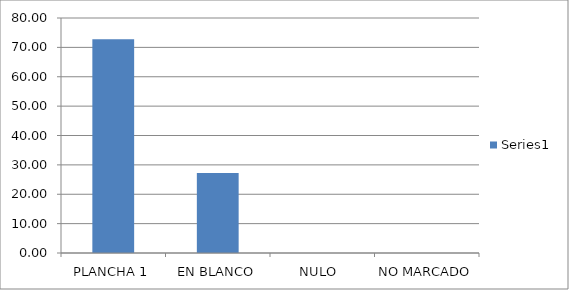
| Category | Series 0 |
|---|---|
| PLANCHA 1 | 72.727 |
| EN BLANCO | 27.273 |
| NULO  | 0 |
| NO MARCADO | 0 |